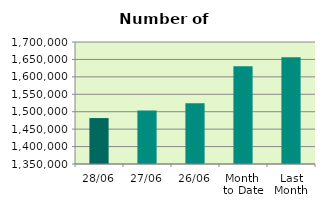
| Category | Series 0 |
|---|---|
| 28/06 | 1481770 |
| 27/06 | 1503364 |
| 26/06 | 1524598 |
| Month 
to Date | 1630183.4 |
| Last
Month | 1656073.545 |